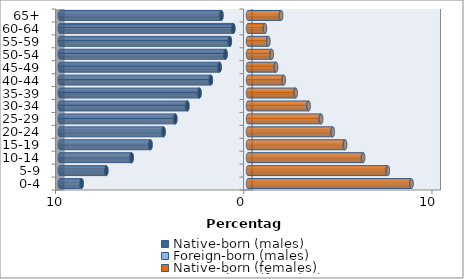
| Category | Native-born (males) | Foreign-born (males) | Native-born (females) | Foreign-born (females) |
|---|---|---|---|---|
| 0-4 | -8.84 | -0.011 | 8.675 | 0.011 |
| 5-9 | -7.526 | -0.015 | 7.415 | 0.015 |
| 10-14 | -6.18 | -0.019 | 6.102 | 0.019 |
| 15-19 | -5.179 | -0.023 | 5.138 | 0.023 |
| 20-24 | -4.484 | -0.026 | 4.482 | 0.027 |
| 25-29 | -3.86 | -0.028 | 3.861 | 0.03 |
| 30-34 | -3.219 | -0.03 | 3.197 | 0.031 |
| 35-39 | -2.576 | -0.031 | 2.51 | 0.032 |
| 40-44 | -1.971 | -0.029 | 1.879 | 0.03 |
| 45-49 | -1.509 | -0.026 | 1.47 | 0.027 |
| 50-54 | -1.191 | -0.022 | 1.246 | 0.022 |
| 55-59 | -0.964 | -0.018 | 1.068 | 0.018 |
| 60-64 | -0.778 | -0.015 | 0.889 | 0.015 |
| 65+ | -1.412 | -0.023 | 1.744 | 0.021 |